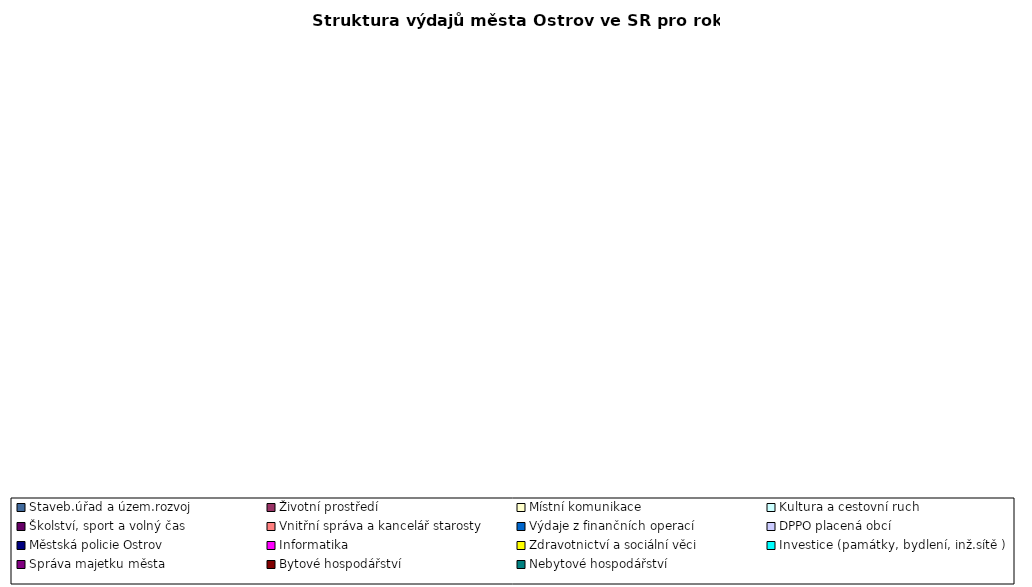
| Category | Series 0 |
|---|---|
| Staveb.úřad a územ.rozvoj  | 0 |
| Životní prostředí | 0 |
| Místní komunikace | 0 |
| Kultura a cestovní ruch | 0 |
| Školství, sport a volný čas | 0 |
| Vnitřní správa a kancelář starosty | 0 |
| Výdaje z finančních operací | 0 |
| DPPO placená obcí | 0 |
| Městská policie Ostrov | 0 |
| Informatika | 0 |
| Zdravotnictví a sociální věci | 0 |
| Investice (památky, bydlení, inž.sítě ) | 0 |
| Správa majetku města | 0 |
| Bytové hospodářství | 0 |
| Nebytové hospodářství | 0 |